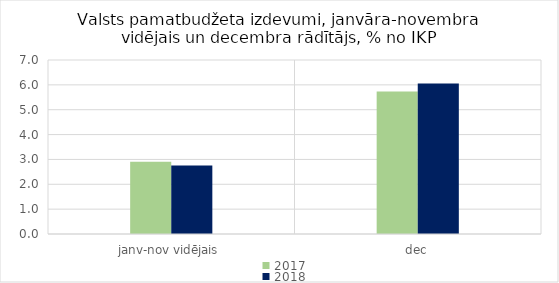
| Category | 2017 | 2018 |
|---|---|---|
| janv-nov vidējais | 2.902 | 2.759 |
| dec | 5.735 | 6.052 |